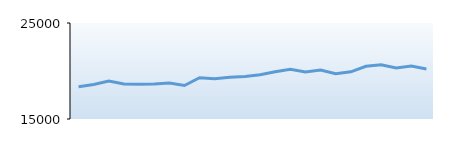
| Category | Sara Hudson |
|---|---|
| 0 | 18357 |
| 1 | 18602 |
| 2 | 18961 |
| 3 | 18639 |
| 4 | 18623 |
| 5 | 18649 |
| 6 | 18752 |
| 7 | 18493 |
| 8 | 19298 |
| 9 | 19191 |
| 10 | 19349 |
| 11 | 19432 |
| 12 | 19601 |
| 13 | 19923 |
| 14 | 20178 |
| 15 | 19901 |
| 16 | 20097 |
| 17 | 19709 |
| 18 | 19915 |
| 19 | 20485 |
| 20 | 20649 |
| 21 | 20313 |
| 22 | 20510 |
| 23 | 20218 |